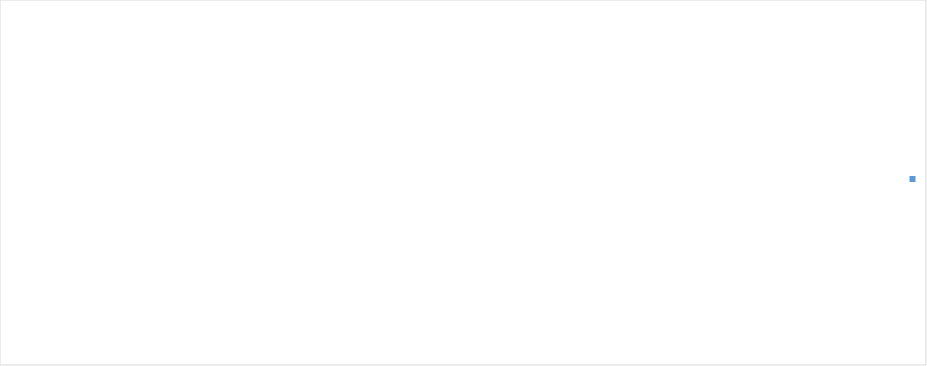
| Category | Total |
|---|---|
|  | 0 |